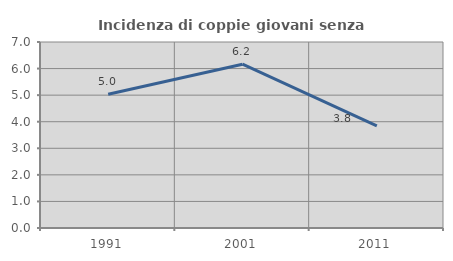
| Category | Incidenza di coppie giovani senza figli |
|---|---|
| 1991.0 | 5.031 |
| 2001.0 | 6.164 |
| 2011.0 | 3.846 |